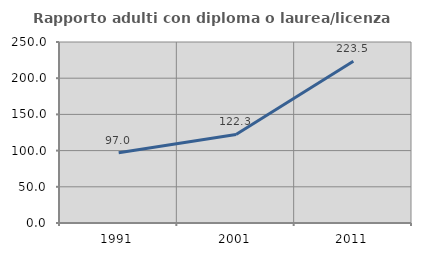
| Category | Rapporto adulti con diploma o laurea/licenza media  |
|---|---|
| 1991.0 | 97 |
| 2001.0 | 122.321 |
| 2011.0 | 223.529 |